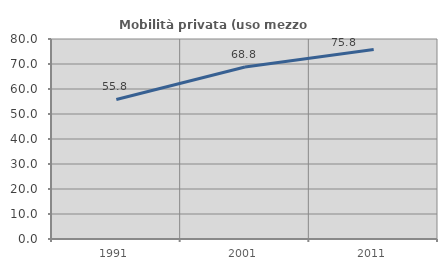
| Category | Mobilità privata (uso mezzo privato) |
|---|---|
| 1991.0 | 55.806 |
| 2001.0 | 68.82 |
| 2011.0 | 75.763 |